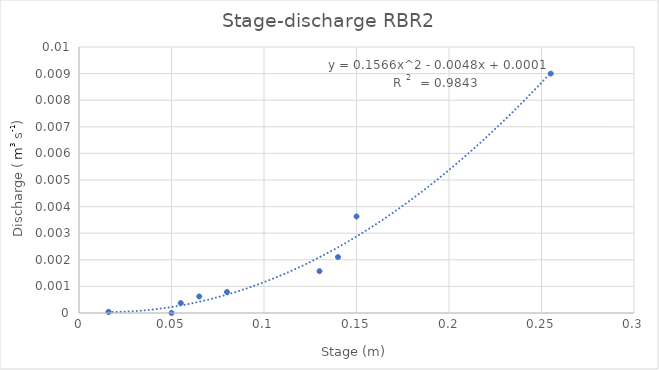
| Category | QA (m3/s) |
|---|---|
| 0.016 | 0 |
| 0.016 | 0 |
| 0.08 | 0.001 |
| 0.065 | 0.001 |
| 0.055 | 0 |
| 0.14 | 0.002 |
| 0.13 | 0.002 |
| 0.255 | 0.009 |
| 0.05 | 0 |
| 0.15 | 0.004 |